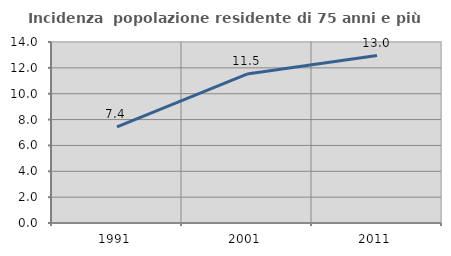
| Category | Incidenza  popolazione residente di 75 anni e più |
|---|---|
| 1991.0 | 7.439 |
| 2001.0 | 11.52 |
| 2011.0 | 12.952 |